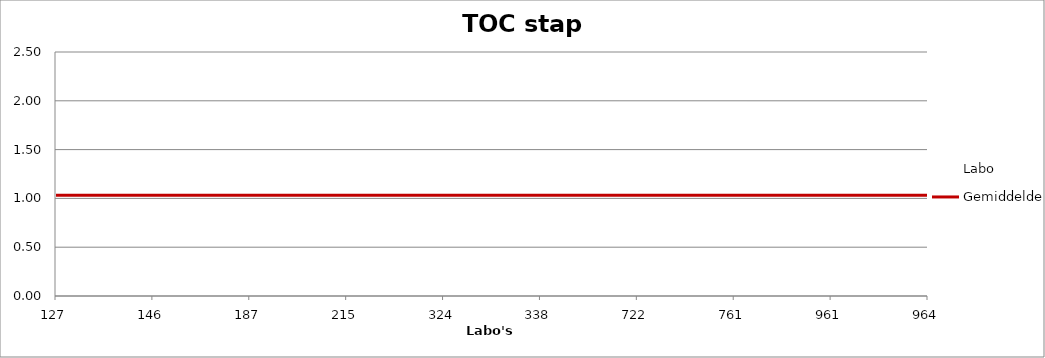
| Category | Labo  | Gemiddelde |
|---|---|---|
| 127.0 | 1.029 | 1.033 |
| 146.0 | 0.996 | 1.033 |
| 187.0 | 1.02 | 1.033 |
| 215.0 | 1.023 | 1.033 |
| 324.0 | 1.04 | 1.033 |
| 338.0 | 1.927 | 1.033 |
| 722.0 | 1.11 | 1.033 |
| 761.0 | 1.029 | 1.033 |
| 961.0 | 1.078 | 1.033 |
| 964.0 | 0.998 | 1.033 |